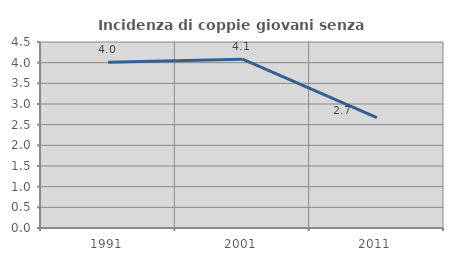
| Category | Incidenza di coppie giovani senza figli |
|---|---|
| 1991.0 | 4.009 |
| 2001.0 | 4.086 |
| 2011.0 | 2.669 |